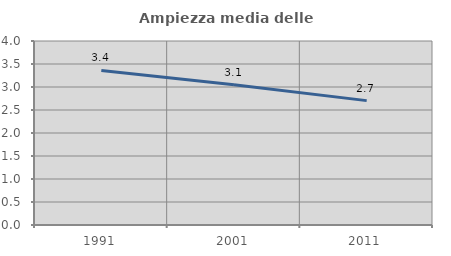
| Category | Ampiezza media delle famiglie |
|---|---|
| 1991.0 | 3.36 |
| 2001.0 | 3.051 |
| 2011.0 | 2.704 |